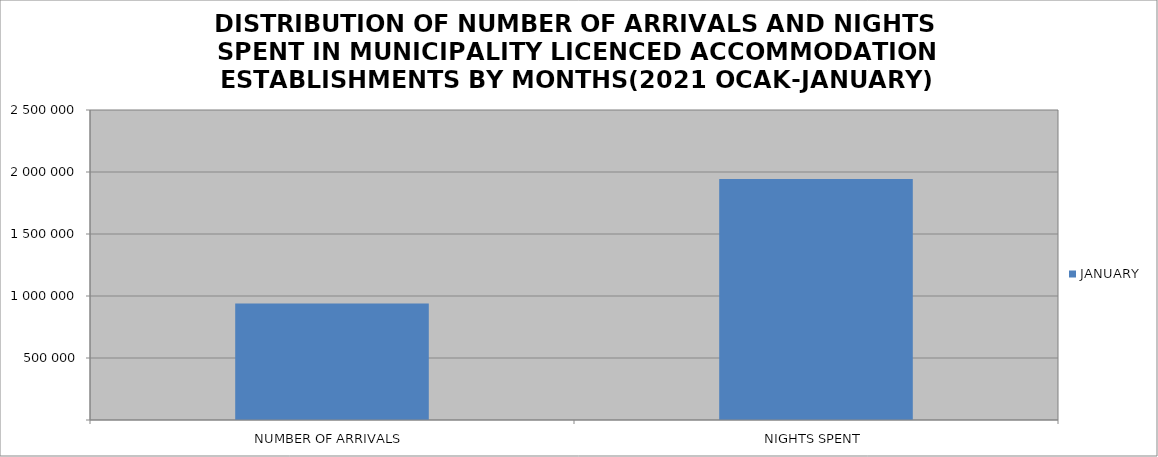
| Category | JANUARY |
|---|---|
| NUMBER OF ARRIVALS | 940331 |
| NIGHTS SPENT | 1943007 |